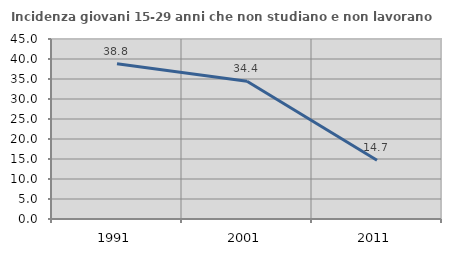
| Category | Incidenza giovani 15-29 anni che non studiano e non lavorano  |
|---|---|
| 1991.0 | 38.827 |
| 2001.0 | 34.426 |
| 2011.0 | 14.706 |